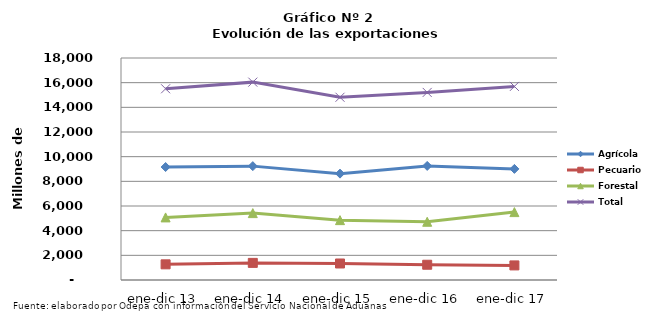
| Category | Agrícola | Pecuario | Forestal | Total |
|---|---|---|---|---|
| ene-dic 13 | 9160197 | 1270145 | 5075079 | 15505421 |
| ene-dic 14 | 9232765 | 1387980 | 5422471 | 16043216 |
| ene-dic 15 | 8623933 | 1338945 | 4854159 | 14817037 |
| ene-dic 16 | 9249478 | 1237090 | 4722929 | 15209497 |
| ene-dic 17 | 9008394 | 1183191 | 5505211 | 15696796 |